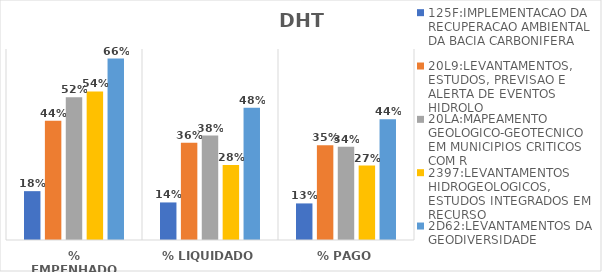
| Category | 125F:IMPLEMENTACAO DA RECUPERACAO AMBIENTAL DA BACIA CARBONIFERA | 20L9:LEVANTAMENTOS, ESTUDOS, PREVISAO E ALERTA DE EVENTOS HIDROLO | 20LA:MAPEAMENTO GEOLOGICO-GEOTECNICO EM MUNICIPIOS CRITICOS COM R | 2397:LEVANTAMENTOS HIDROGEOLOGICOS, ESTUDOS INTEGRADOS EM RECURSO | 2D62:LEVANTAMENTOS DA GEODIVERSIDADE |
|---|---|---|---|---|---|
| % EMPENHADO | 0.179 | 0.437 | 0.523 | 0.545 | 0.665 |
| % LIQUIDADO | 0.138 | 0.356 | 0.383 | 0.275 | 0.485 |
| % PAGO | 0.134 | 0.347 | 0.342 | 0.273 | 0.442 |